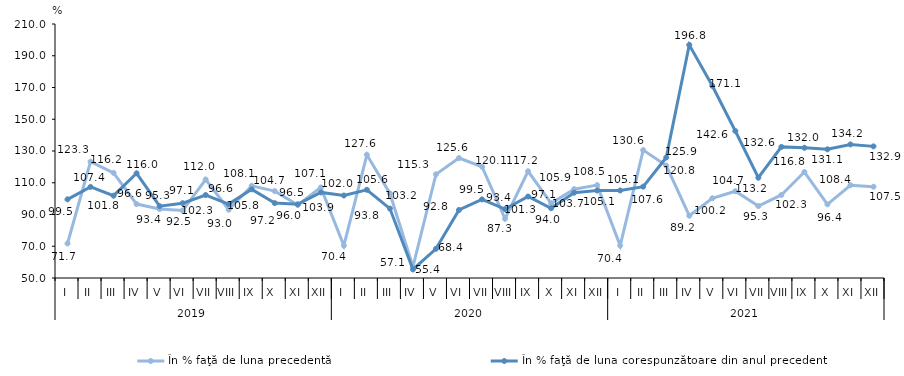
| Category | În % faţă de luna precedentă | În % faţă de luna corespunzătoare din anul precedent |
|---|---|---|
| 0 | 71.738 | 99.543 |
| 1 | 123.272 | 107.401 |
| 2 | 116.244 | 101.85 |
| 3 | 96.58 | 115.967 |
| 4 | 93.409 | 95.255 |
| 5 | 92.49 | 97.113 |
| 6 | 112.048 | 102.267 |
| 7 | 93.02 | 96.592 |
| 8 | 108.061 | 105.849 |
| 9 | 104.713 | 97.175 |
| 10 | 95.961 | 96.47 |
| 11 | 107.051 | 103.919 |
| 12 | 70.382 | 101.955 |
| 13 | 127.632 | 105.56 |
| 14 | 103.241 | 93.753 |
| 15 | 57.064 | 55.394 |
| 16 | 115.32 | 68.388 |
| 17 | 125.558 | 92.839 |
| 18 | 120.095 | 99.506 |
| 19 | 87.312 | 93.4 |
| 20 | 117.23 | 101.324 |
| 21 | 97.097 | 93.954 |
| 22 | 105.938 | 103.722 |
| 23 | 108.494 | 105.12 |
| 24 | 70.408 | 105.144 |
| 25 | 130.566 | 107.561 |
| 26 | 120.83 | 125.886 |
| 27 | 89.231 | 196.848 |
| 28 | 100.211 | 171.057 |
| 29 | 104.661 | 142.587 |
| 30 | 95.309 | 113.159 |
| 31 | 102.299 | 132.583 |
| 32 | 116.75 | 132.04 |
| 33 | 96.374 | 131.057 |
| 34 | 108.439 | 134.151 |
| 35 | 107.495 | 132.915 |